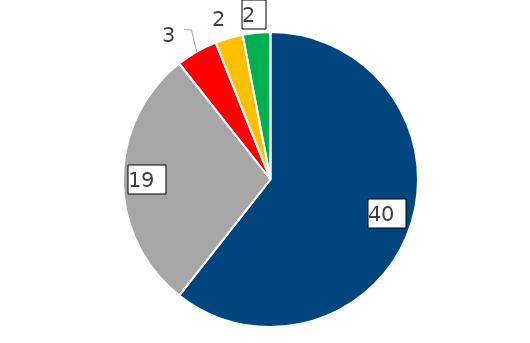
| Category | 2021 |
|---|---|
| E-mail a Transparencia CORREOS | 40 |
| Portal Transparencia AGE | 19 |
| Registro general CORREOS | 3 |
| Correo postal a Transparencia CORREOS | 2 |
| Otros | 2 |